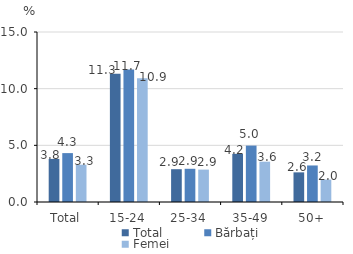
| Category | Total | Bărbați | Femei |
|---|---|---|---|
| Total | 3.802 | 4.314 | 3.291 |
| 15-24 | 11.306 | 11.682 | 10.926 |
| 25-34 | 2.894 | 2.93 | 2.859 |
| 35-49 | 4.249 | 4.978 | 3.557 |
| 50+ | 2.616 | 3.224 | 1.975 |